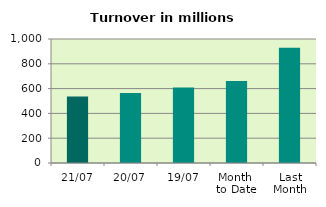
| Category | Series 0 |
|---|---|
| 21/07 | 535.82 |
| 20/07 | 565.463 |
| 19/07 | 609.217 |
| Month 
to Date | 660.556 |
| Last
Month | 929.439 |